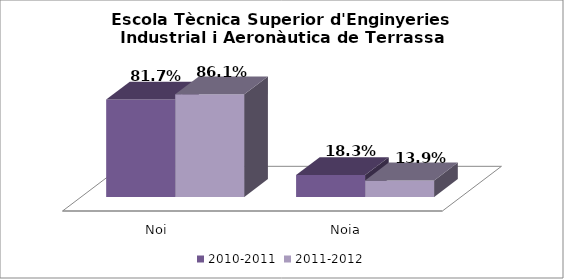
| Category | 2010-2011 | 2011-2012 |
|---|---|---|
| Noi | 0.817 | 0.861 |
| Noia | 0.183 | 0.139 |